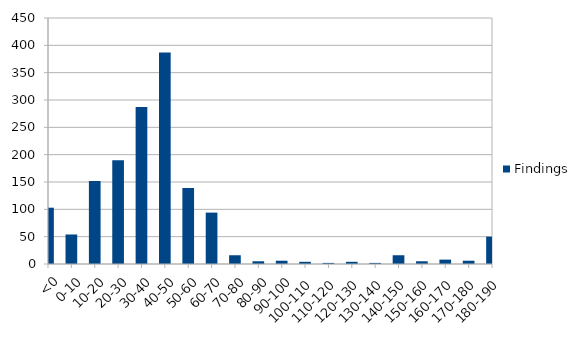
| Category | Findings |
|---|---|
| <0 | 103 |
| 0-10 | 54 |
| 10-20 | 152 |
| 20-30 | 190 |
| 30-40 | 287 |
| 40-50 | 387 |
| 50-60 | 139 |
| 60-70 | 94 |
| 70-80 | 16 |
| 80-90 | 5 |
| 90-100 | 6 |
| 100-110 | 4 |
| 110-120 | 2 |
| 120-130 | 4 |
| 130-140 | 2 |
| 140-150 | 16 |
| 150-160 | 5 |
| 160-170 | 8 |
| 170-180 | 6 |
| 180-190 | 50 |